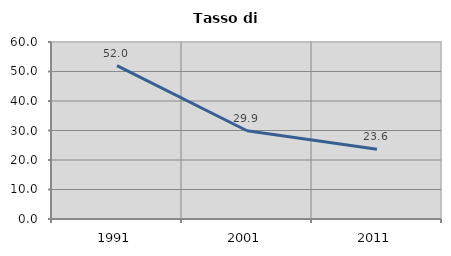
| Category | Tasso di disoccupazione   |
|---|---|
| 1991.0 | 51.975 |
| 2001.0 | 29.904 |
| 2011.0 | 23.644 |